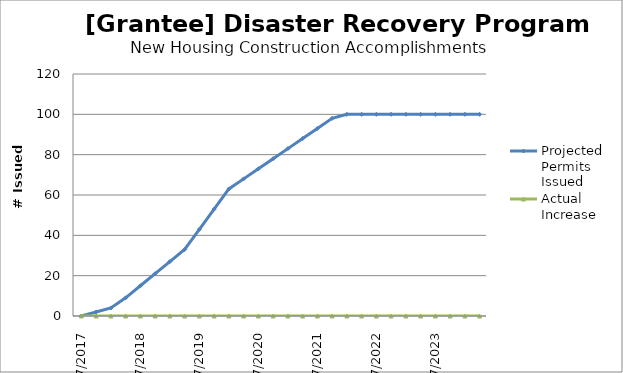
| Category | Projected Permits Issued | Actual Increase |
|---|---|---|
| 7/2017 | 0 | 0 |
| 10/2017 | 2 | 0 |
| 1/2018 | 4 | 0 |
| 4/2018 | 9 | 0 |
| 7/2018 | 15 | 0 |
| 10/2018 | 21 | 0 |
| 1/2019 | 27 | 0 |
| 4/2019 | 33 | 0 |
| 7/2019 | 43 | 0 |
| 10/2019 | 53 | 0 |
| 1/2020 | 63 | 0 |
| 4/2020 | 68 | 0 |
| 7/2020 | 73 | 0 |
| 10/2020 | 78 | 0 |
| 1/2021 | 83 | 0 |
| 4/2021 | 88 | 0 |
| 7/2021 | 93 | 0 |
| 10/2021 | 98 | 0 |
| 1/2022 | 100 | 0 |
| 4/2022 | 100 | 0 |
| 7/2022 | 100 | 0 |
| 10/2022 | 100 | 0 |
| 1/2023 | 100 | 0 |
| 4/2023 | 100 | 0 |
| 7/2023 | 100 | 0 |
| 10/2023 | 100 | 0 |
| 1/2024 | 100 | 0 |
| 4/2024 | 100 | 0 |